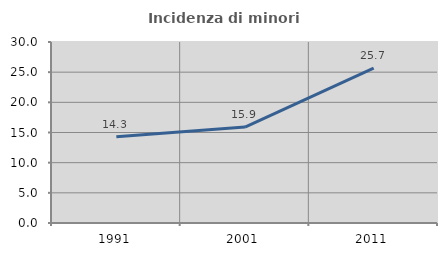
| Category | Incidenza di minori stranieri |
|---|---|
| 1991.0 | 14.286 |
| 2001.0 | 15.909 |
| 2011.0 | 25.668 |